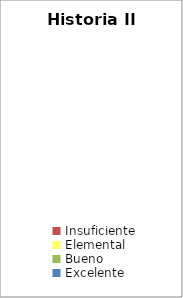
| Category | Historia II |
|---|---|
| Insuficiente | 0 |
| Elemental | 0 |
| Bueno | 0 |
| Excelente | 0 |